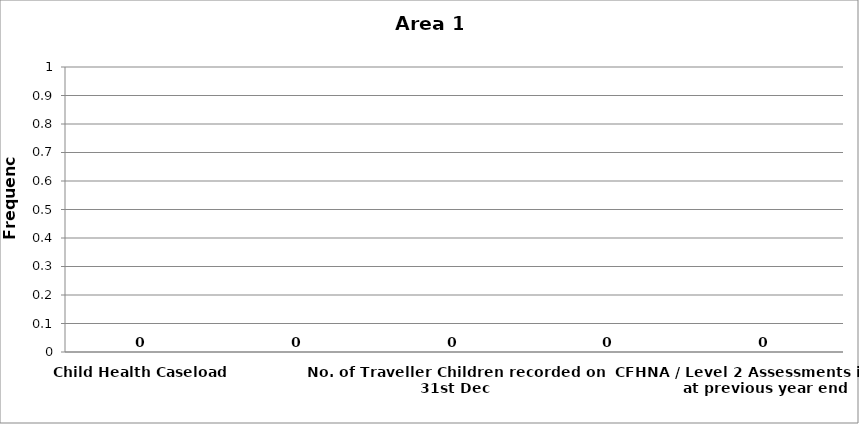
| Category | Area 1 |
|---|---|
| Child Health Caseload | 0 |
| No. of Roma Children recorded on 31st Dec | 0 |
| No. of Traveller Children recorded on 31st Dec | 0 |
| Homeless Children recorded on 31st Dec | 0 |
| CFHNA / Level 2 Assessments in place at previous year end | 0 |